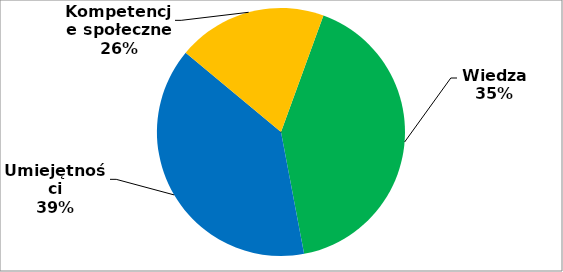
| Category | Series 0 |
|---|---|
| 0 | 17 |
| 1 | 16 |
| 2 | 8 |